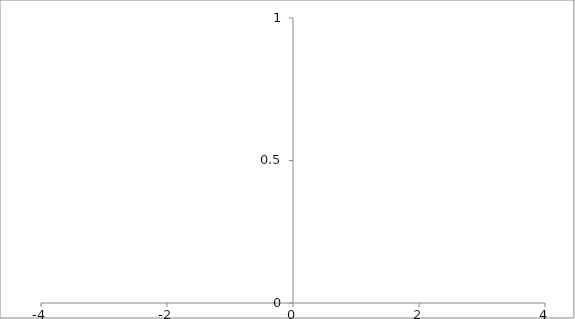
| Category | Series 0 |
|---|---|
| 0.0 | 0 |
| 0.0 | 0 |
| 0.0 | 0 |
| 0.0 | 0 |
| 0.0 | 0 |
| 0.0 | 0 |
| 0.0 | 0 |
| 0.0 | 0 |
| 0.0 | 0 |
| 0.0 | 0 |
| 0.0 | 0 |
| 0.0 | 0 |
| 0.0 | 0 |
| 0.0 | 0 |
| 0.0 | 0 |
| 0.0 | 0 |
| 0.0 | 0 |
| 0.0 | 0 |
| 0.0 | 0 |
| 0.0 | 0 |
| 0.0 | 0 |
| 0.0 | 0 |
| 0.0 | 0 |
| 0.0 | 0 |
| 0.0 | 0 |
| 0.0 | 0 |
| 0.0 | 0 |
| 0.0 | 0 |
| 0.0 | 0 |
| 0.0 | 0 |
| 0.0 | 0 |
| 0.0 | 0 |
| 0.0 | 0 |
| 0.0 | 0 |
| 0.0 | 0 |
| 0.0 | 0 |
| 0.0 | 0 |
| 0.0 | 0 |
| 0.0 | 0 |
| 0.0 | 0 |
| 0.0 | 0 |
| 0.0 | 0 |
| 0.0 | 0 |
| 0.0 | 0 |
| 0.0 | 0 |
| 0.0 | 0 |
| 0.0 | 0 |
| 0.0 | 0 |
| 0.0 | 0 |
| 0.0 | 0 |
| 0.0 | 0 |
| 0.0 | 0 |
| 0.0 | 0 |
| 0.0 | 0 |
| 0.0 | 0 |
| 0.0 | 0 |
| 0.0 | 0 |
| 0.0 | 0 |
| 0.0 | 0 |
| 0.0 | 0 |
| 0.0 | 0 |
| 0.0 | 0 |
| 0.0 | 0 |
| 0.0 | 0 |
| 0.0 | 0 |
| 0.0 | 0 |
| 0.0 | 0 |
| 0.0 | 0 |
| 0.0 | 0 |
| 0.0 | 0 |
| 0.0 | 0 |
| 0.0 | 0 |
| 0.0 | 0 |
| 0.0 | 0 |
| 0.0 | 0 |
| 0.0 | 0 |
| 0.0 | 0 |
| 0.0 | 0 |
| 0.0 | 0 |
| 0.0 | 0 |
| 0.0 | 0 |
| 0.0 | 0 |
| 0.0 | 0 |
| 0.0 | 0 |
| 0.0 | 0 |
| 0.0 | 0 |
| 0.0 | 0 |
| 0.0 | 0 |
| 0.0 | 0 |
| 0.0 | 0 |
| 0.0 | 0 |
| 0.0 | 0 |
| 0.0 | 0 |
| 0.0 | 0 |
| 0.0 | 0 |
| 0.0 | 0 |
| 0.0 | 0 |
| 0.0 | 0 |
| 0.0 | 0 |
| 0.0 | 0 |
| 0.0 | 0 |